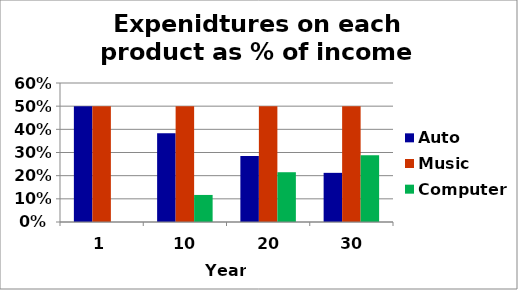
| Category | Auto | Music | Computer |
|---|---|---|---|
| 1.0 | 0.5 | 0.5 | 0 |
| 10.0 | 0.383 | 0.5 | 0.117 |
| 20.0 | 0.285 | 0.5 | 0.215 |
| 30.0 | 0.212 | 0.5 | 0.288 |